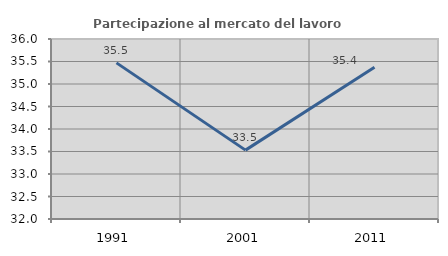
| Category | Partecipazione al mercato del lavoro  femminile |
|---|---|
| 1991.0 | 35.469 |
| 2001.0 | 33.531 |
| 2011.0 | 35.37 |